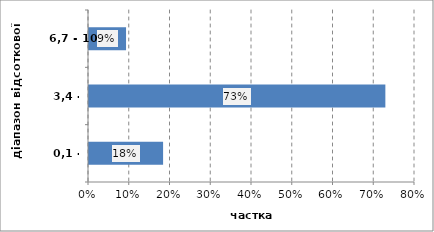
| Category | Series 0 |
|---|---|
| 0,1 - 3,4 | 0.182 |
| 3,4 - 6,7 | 0.727 |
| 6,7 - 10 | 0.091 |